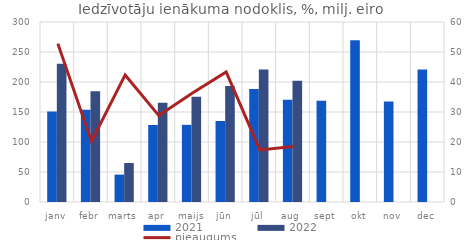
| Category | 2021 | 2022 |
|---|---|---|
| janv | 150.693 | 230.249 |
| febr | 153.563 | 184.559 |
| marts | 45.661 | 65.002 |
| apr | 128.345 | 165.307 |
| maijs | 128.556 | 175.243 |
| jūn | 134.986 | 193.472 |
| jūl | 188.253 | 220.964 |
| aug | 170.505 | 202.017 |
| sept | 168.642 | 0 |
| okt | 269.575 | 0 |
| nov | 167.634 | 0 |
| dec | 220.865 | 0 |